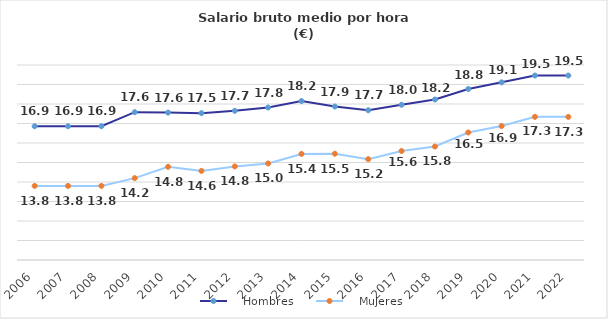
| Category |    Hombres |    Mujeres |
|---|---|---|
| 2006.0 | 16.86 | 13.8 |
| 2007.0 | 16.86 | 13.8 |
| 2008.0 | 16.86 | 13.8 |
| 2009.0 | 17.58 | 14.2 |
| 2010.0 | 17.56 | 14.78 |
| 2011.0 | 17.53 | 14.57 |
| 2012.0 | 17.65 | 14.8 |
| 2013.0 | 17.82 | 14.95 |
| 2014.0 | 18.15 | 15.44 |
| 2015.0 | 17.87 | 15.45 |
| 2016.0 | 17.68 | 15.17 |
| 2017.0 | 17.96 | 15.59 |
| 2018.0 | 18.23 | 15.82 |
| 2019.0 | 18.77 | 16.54 |
| 2020.0 | 19.11 | 16.87 |
| 2021.0 | 19.46 | 17.34 |
| 2022.0 | 19.46 | 17.34 |